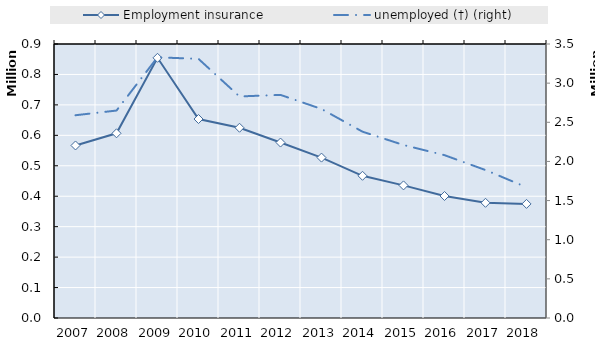
| Category | Series 4 | Series 5 | Series 6 | Series 7 | Series 8 | Series 9 | Series 10 | Series 11 | Series 12 | Series 13 | Series 14 | Series 15 | Series 16 | Series 17 | Series 18 | Series 19 | Employment insurance  |
|---|---|---|---|---|---|---|---|---|---|---|---|---|---|---|---|---|---|
| 2007.0 |  |  |  |  |  |  |  |  |  |  |  |  |  |  |  |  | 566666 |
| 2008.0 |  |  |  |  |  |  |  |  |  |  |  |  |  |  |  |  | 606686 |
| 2009.0 |  |  |  |  |  |  |  |  |  |  |  |  |  |  |  |  | 854617 |
| 2010.0 |  |  |  |  |  |  |  |  |  |  |  |  |  |  |  |  | 653553 |
| 2011.0 |  |  |  |  |  |  |  |  |  |  |  |  |  |  |  |  | 624953 |
| 2012.0 |  |  |  |  |  |  |  |  |  |  |  |  |  |  |  |  | 576277 |
| 2013.0 |  |  |  |  |  |  |  |  |  |  |  |  |  |  |  |  | 526858 |
| 2014.0 |  |  |  |  |  |  |  |  |  |  |  |  |  |  |  |  | 467052 |
| 2015.0 |  |  |  |  |  |  |  |  |  |  |  |  |  |  |  |  | 435563 |
| 2016.0 |  |  |  |  |  |  |  |  |  |  |  |  |  |  |  |  | 400746 |
| 2017.0 |  |  |  |  |  |  |  |  |  |  |  |  |  |  |  |  | 378344 |
| 2018.0 |  |  |  |  |  |  |  |  |  |  |  |  |  |  |  |  | 374762 |